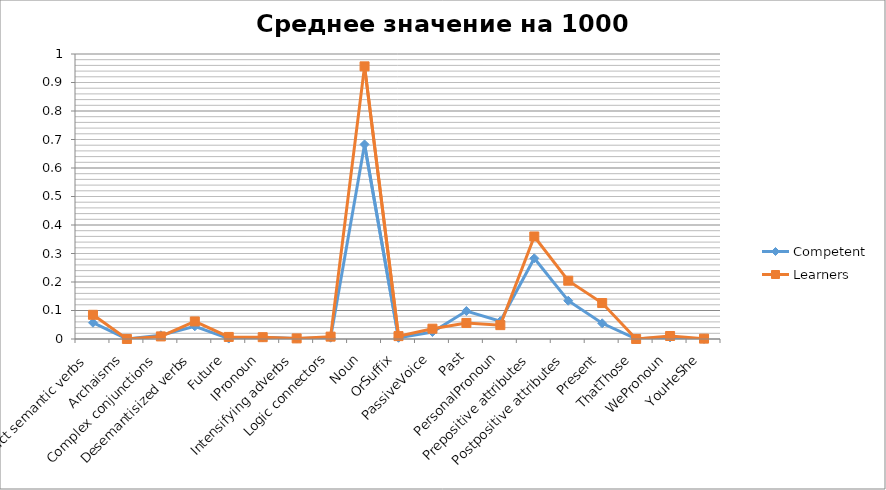
| Category | Competent | Learners |
|---|---|---|
| Abstract semantic verbs | 0.057 | 0.085 |
| Archaisms | 0 | 0 |
| Complex conjunctions | 0.013 | 0.009 |
| Desemantisized verbs | 0.045 | 0.062 |
| Future | 0.002 | 0.007 |
| IPronoun | 0.006 | 0.006 |
| Intensifying adverbs | 0.002 | 0.002 |
| Logic connectors | 0.005 | 0.008 |
| Noun | 0.683 | 0.957 |
| OrSuffix | 0.004 | 0.01 |
| PassiveVoice | 0.025 | 0.036 |
| Past | 0.098 | 0.056 |
| PersonalPronoun | 0.063 | 0.049 |
| Prepositive attributes | 0.283 | 0.36 |
| Postpositive attributes | 0.134 | 0.205 |
| Present | 0.055 | 0.126 |
| ThatThose | 0.001 | 0 |
| WePronoun | 0.006 | 0.011 |
| YouHeShe | 0 | 0.001 |